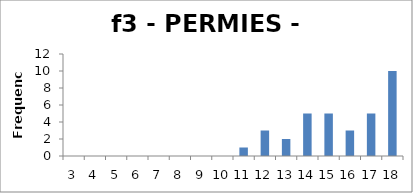
| Category | Frequency |
|---|---|
| 3.0 | 0 |
| 4.0 | 0 |
| 5.0 | 0 |
| 6.0 | 0 |
| 7.0 | 0 |
| 8.0 | 0 |
| 9.0 | 0 |
| 10.0 | 0 |
| 11.0 | 1 |
| 12.0 | 3 |
| 13.0 | 2 |
| 14.0 | 5 |
| 15.0 | 5 |
| 16.0 | 3 |
| 17.0 | 5 |
| 18.0 | 10 |